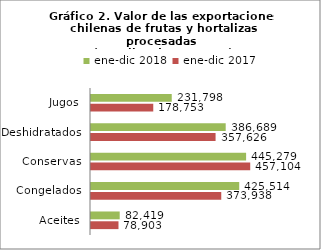
| Category | ene-dic 2017 | ene-dic 2018 |
|---|---|---|
| Aceites | 78903396.58 | 82419499.23 |
| Congelados | 373937814.5 | 425514297.83 |
| Conservas | 457104089.5 | 445279186.19 |
| Deshidratados | 357625749.96 | 386689203.93 |
| Jugos | 178752847.9 | 231798402.51 |